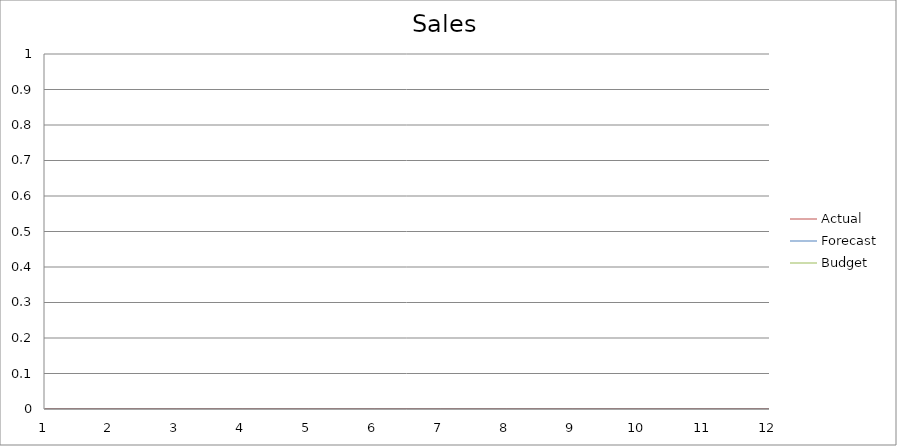
| Category | Budget | Forecast | Actual |
|---|---|---|---|
| 0 | 900 | 2160 | 2130 |
| 1 | 1090 | 2060 | 1890 |
| 2 | 1200 | 1010 | 1240 |
| 3 | 3060 | 2980 | 1410 |
| 4 | 3070 | 2980 | 750 |
| 5 | 3460 | 2080 | 1440 |
| 6 | 1530 | 540 | 2190 |
| 7 | 2200 | 2580 | 3140 |
| 8 | 2940 | 1300 | 2500 |
| 9 | 2660 | 1420 | 2200 |
| 10 | 3160 | 3440 | 2460 |
| 11 | 3290 | 3380 | 1210 |